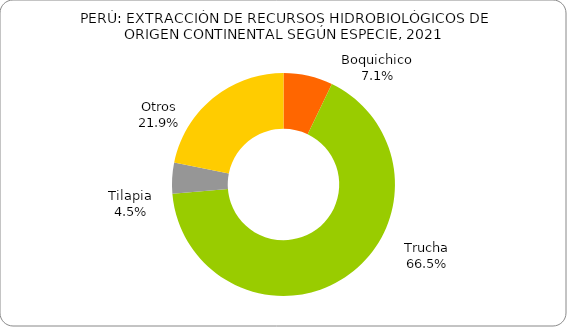
| Category | Series 0 |
|---|---|
| Boquichico | 0.071 |
| Trucha | 0.665 |
| Tilapia | 0.045 |
| Otros | 0.219 |